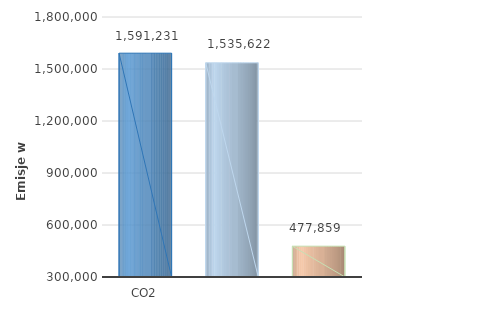
| Category | Series 0 |
|---|---|
| CO2 | 1591231 |